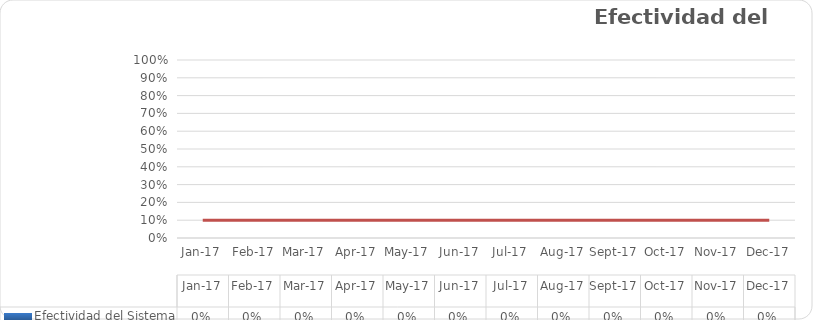
| Category | Efectividad del Sistema |
|---|---|
| 2017-01-01 | 0 |
| 2017-02-01 | 0 |
| 2017-03-01 | 0 |
| 2017-04-01 | 0 |
| 2017-05-01 | 0 |
| 2017-06-01 | 0 |
| 2017-07-01 | 0 |
| 2017-08-01 | 0 |
| 2017-09-01 | 0 |
| 2017-10-01 | 0 |
| 2017-11-01 | 0 |
| 2017-12-01 | 0 |